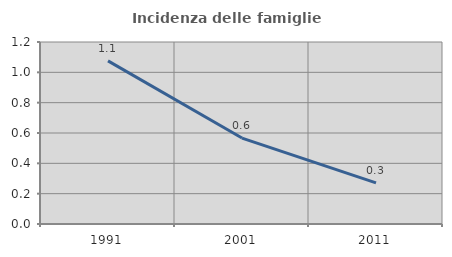
| Category | Incidenza delle famiglie numerose |
|---|---|
| 1991.0 | 1.075 |
| 2001.0 | 0.567 |
| 2011.0 | 0.271 |